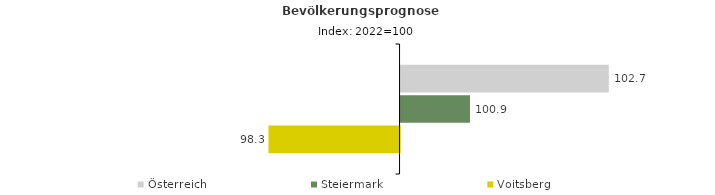
| Category | Österreich | Steiermark | Voitsberg |
|---|---|---|---|
| 2022.0 | 102.7 | 100.9 | 98.3 |